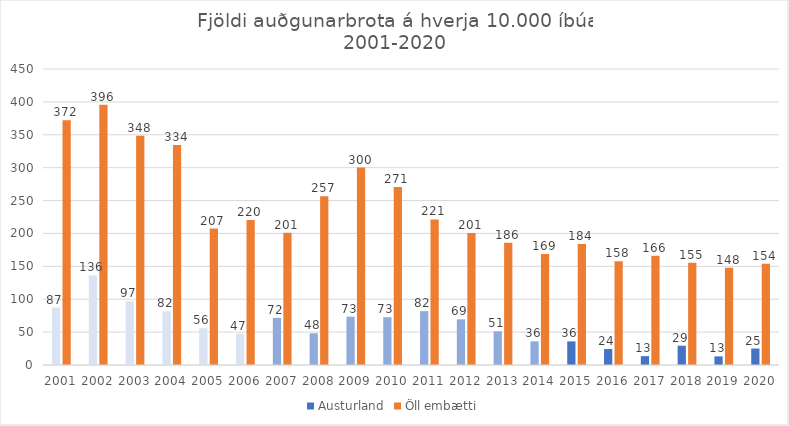
| Category | Austurland | Öll embætti |
|---|---|---|
| 2001.0 | 87.175 | 372.001 |
| 2002.0 | 136.464 | 395.808 |
| 2003.0 | 96.955 | 348.401 |
| 2004.0 | 81.574 | 334.457 |
| 2005.0 | 55.695 | 207.445 |
| 2006.0 | 47.411 | 220.304 |
| 2007.0 | 71.661 | 201.034 |
| 2008.0 | 48.198 | 256.623 |
| 2009.0 | 73.495 | 300.189 |
| 2010.0 | 72.683 | 270.657 |
| 2011.0 | 81.907 | 221.276 |
| 2012.0 | 69.383 | 200.77 |
| 2013.0 | 51.286 | 185.753 |
| 2014.0 | 35.971 | 168.731 |
| 2015.0 | 35.875 | 183.849 |
| 2016.0 | 24.282 | 157.585 |
| 2017.0 | 13.465 | 166.162 |
| 2018.0 | 29.307 | 155.392 |
| 2019.0 | 13.079 | 147.658 |
| 2020.0 | 25.013 | 153.795 |